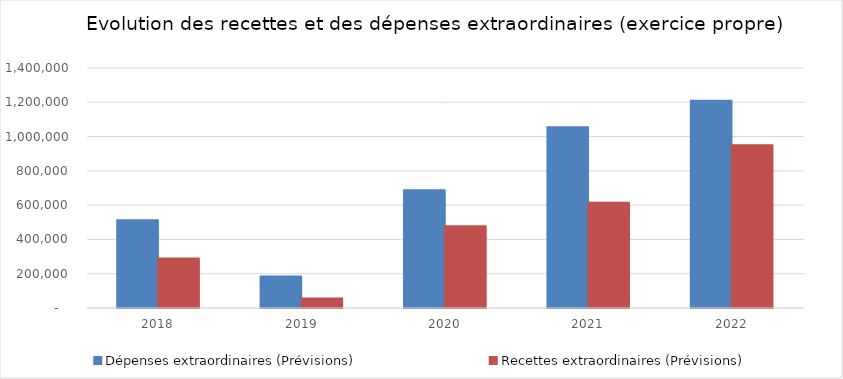
| Category | Dépenses extraordinaires (Prévisions) | Recettes extraordinaires (Prévisions) |
|---|---|---|
| 2018.0 | 509467.77 | 285297.32 |
| 2019.0 | 181276.49 | 53000 |
| 2020.0 | 683250 | 473350 |
| 2021.0 | 1051767 | 610800 |
| 2022.0 | 1206280.45 | 947100 |